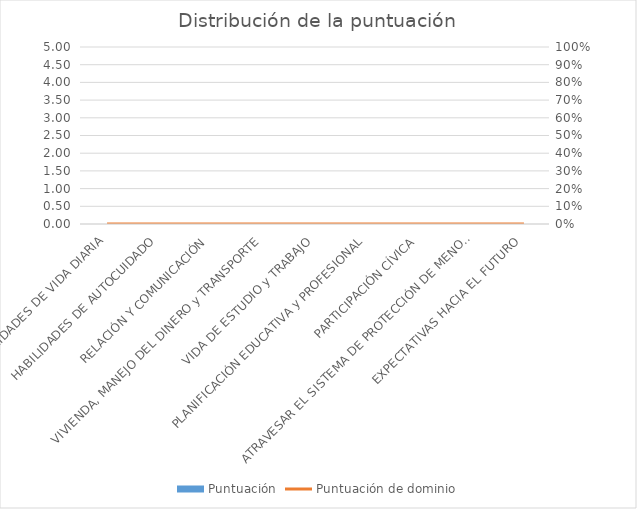
| Category | Puntuación |
|---|---|
| HABILIDADES DE VIDA DIARIA | 0 |
| HABILIDADES DE AUTOCUIDADO | 0 |
| RELACIÓN Y COMUNICACIÓN | 0 |
| VIVIENDA, MANEJO DEL DINERO y TRANSPORTE | 0 |
| VIDA DE ESTUDIO y TRABAJO | 0 |
| PLANIFICACIÓN EDUCATIVA y PROFESIONAL | 0 |
| PARTICIPACIÓN CÍVICA | 0 |
| ATRAVESAR EL SISTEMA DE PROTECCIÓN DE MENORES | 0 |
| EXPECTATIVAS HACIA EL FUTURO | 0 |